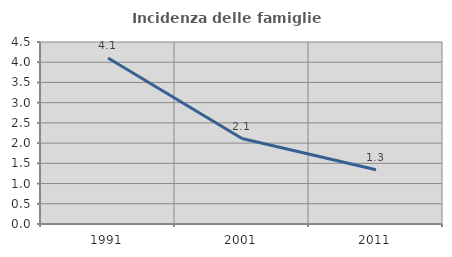
| Category | Incidenza delle famiglie numerose |
|---|---|
| 1991.0 | 4.107 |
| 2001.0 | 2.113 |
| 2011.0 | 1.342 |